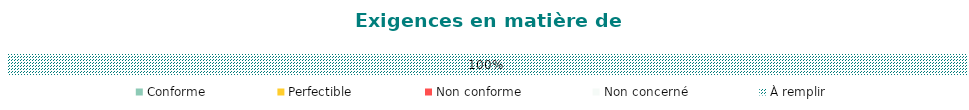
| Category | Conforme | Perfectible | Non conforme | Non concerné | À remplir |
|---|---|---|---|---|---|
| Ressources | 0 | 0 | 0 | 0 | 1 |